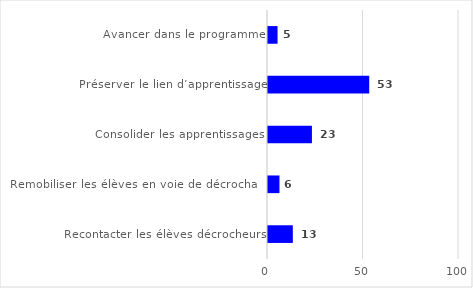
| Category | Series 0 |
|---|---|
| Avancer dans le programme | 5 |
| Préserver le lien d’apprentissage | 53 |
| Consolider les apprentissages | 23 |
| Remobiliser les élèves en voie de décrochage | 6 |
| Recontacter les élèves décrocheurs | 13 |